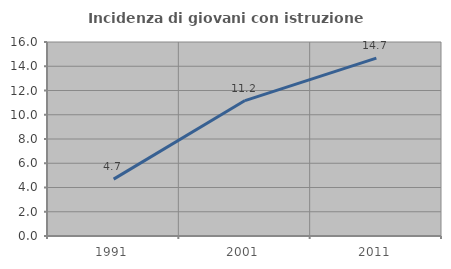
| Category | Incidenza di giovani con istruzione universitaria |
|---|---|
| 1991.0 | 4.69 |
| 2001.0 | 11.169 |
| 2011.0 | 14.667 |